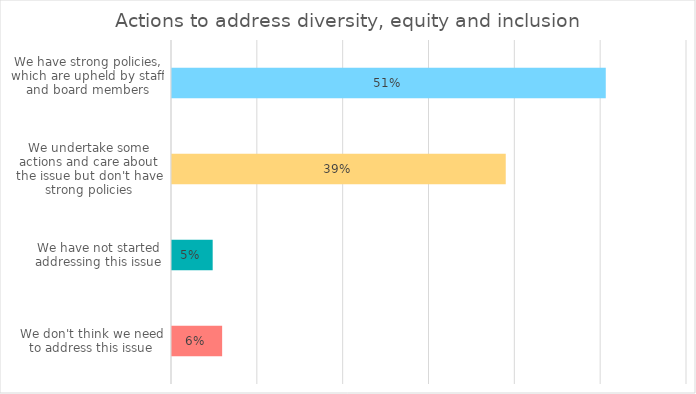
| Category | Series 0 |
|---|---|
| We have strong policies, which are upheld by staff and board members | 50.536 |
| We undertake some actions and care about the issue but don't have strong policies | 38.883 |
| We have not started addressing this issue | 4.739 |
| We don't think we need to address this issue | 5.841 |